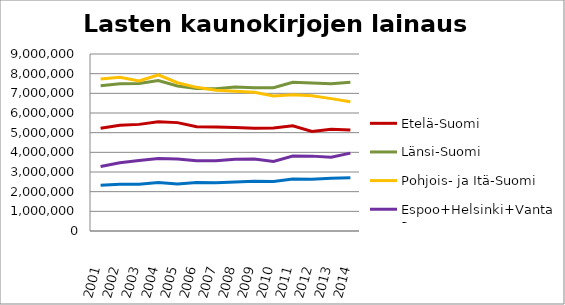
| Category | Etelä-Suomi | Länsi-Suomi | Pohjois- ja Itä-Suomi | Espoo+Helsinki+Vantaa | Muu Uusimaa |
|---|---|---|---|---|---|
| 2001.0 | 5223744 | 7386191 | 7727132 | 3278208 | 2320265 |
| 2002.0 | 5381526 | 7492269 | 7822712 | 3469207 | 2376568 |
| 2003.0 | 5421565 | 7502974 | 7631800 | 3586658 | 2380878 |
| 2004.0 | 5553256 | 7655005 | 7934424 | 3689924 | 2462200 |
| 2005.0 | 5510690 | 7373389 | 7538641 | 3664558 | 2395963 |
| 2006.0 | 5306095 | 7248917 | 7303926 | 3567311 | 2464284 |
| 2007.0 | 5285320 | 7233239 | 7153245 | 3568379 | 2451582 |
| 2008.0 | 5264498 | 7326391 | 7104299 | 3644415 | 2493159 |
| 2009.0 | 5230311 | 7286632 | 7055877 | 3655444 | 2525473 |
| 2010.0 | 5231723 | 7284008 | 6865479 | 3536651 | 2516300 |
| 2011.0 | 5348418 | 7564698 | 6925778 | 3816341 | 2643152 |
| 2012.0 | 5062158 | 7520354 | 6878240 | 3807079 | 2635299 |
| 2013.0 | 5170659 | 7491878 | 6730356 | 3746529 | 2678289 |
| 2014.0 | 5138988 | 7561275 | 6567288 | 3960479 | 2707789 |